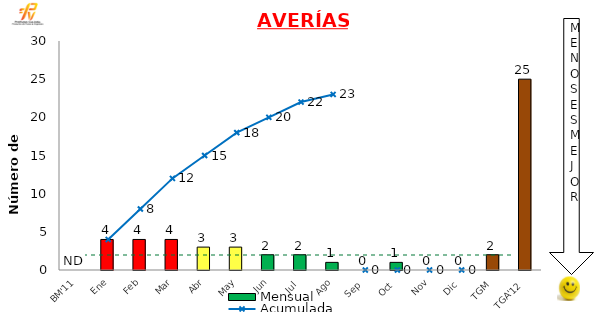
| Category | Mensual |
|---|---|
| BM'11 | 0 |
| Ene | 4 |
| Feb | 4 |
| Mar | 4 |
| Abr | 3 |
| May | 3 |
| Jun | 2 |
| Jul | 2 |
| Ago | 1 |
| Sep | 0 |
| Oct | 1 |
| Nov | 0 |
| Dic | 0 |
| TGM | 2 |
| TGA'12 | 25 |